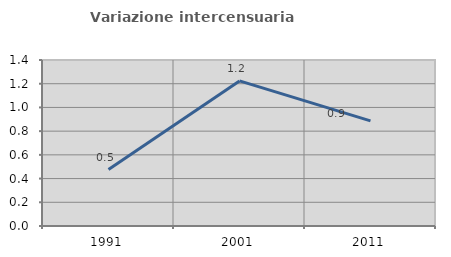
| Category | Variazione intercensuaria annua |
|---|---|
| 1991.0 | 0.476 |
| 2001.0 | 1.224 |
| 2011.0 | 0.886 |